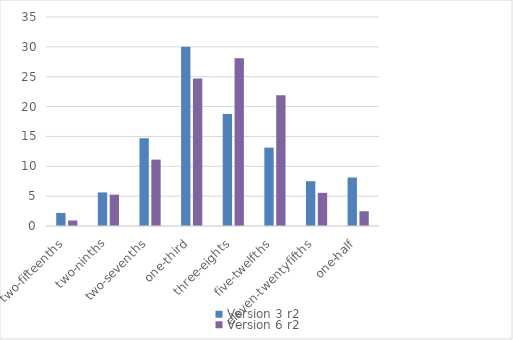
| Category | Version 3 r2 | Version 6 r2 |
|---|---|---|
| two-fifteenths | 2.188 | 0.926 |
| two-ninths | 5.625 | 5.247 |
| two-sevenths | 14.688 | 11.111 |
| one-third | 30 | 24.691 |
| three-eights | 18.75 | 28.086 |
| five-twelfths | 13.125 | 21.914 |
| eleven-twentyfifths | 7.5 | 5.556 |
| one-half | 8.125 | 2.469 |